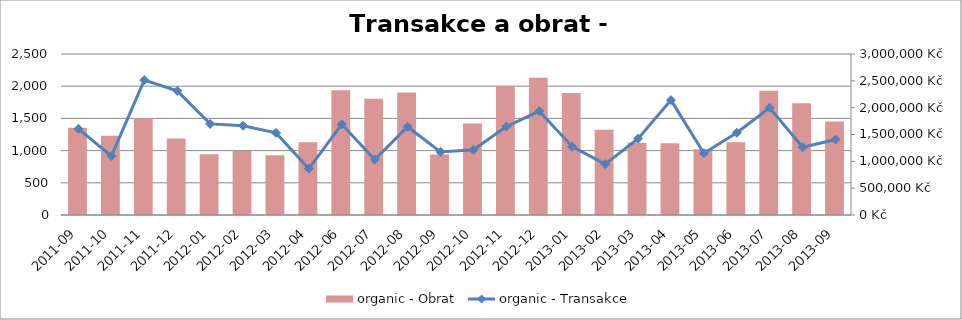
| Category | organic - Obrat |
|---|---|
| 2011-09 | 1625663.641 |
| 2011-10 | 1476812.207 |
| 2011-11 | 1803935.248 |
| 2011-12 | 1425163.879 |
| 2012-01 | 1133553.059 |
| 2012-02 | 1199037.248 |
| 2012-03 | 1115182.801 |
| 2012-04 | 1354646.533 |
| 2012-06 | 2322866.539 |
| 2012-07 | 2168274.402 |
| 2012-08 | 2280523.125 |
| 2012-09 | 1128459.892 |
| 2012-10 | 1704582.248 |
| 2012-11 | 2407538.364 |
| 2012-12 | 2556754.395 |
| 2013-01 | 2275561.142 |
| 2013-02 | 1589456.447 |
| 2013-03 | 1346859.656 |
| 2013-04 | 1339163.757 |
| 2013-05 | 1227276.441 |
| 2013-06 | 1356767.01 |
| 2013-07 | 2315645.902 |
| 2013-08 | 2084450.006 |
| 2013-09 | 1741411.326 |